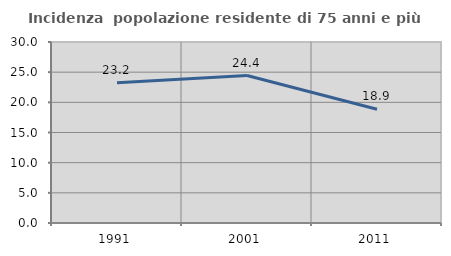
| Category | Incidenza  popolazione residente di 75 anni e più |
|---|---|
| 1991.0 | 23.246 |
| 2001.0 | 24.439 |
| 2011.0 | 18.864 |